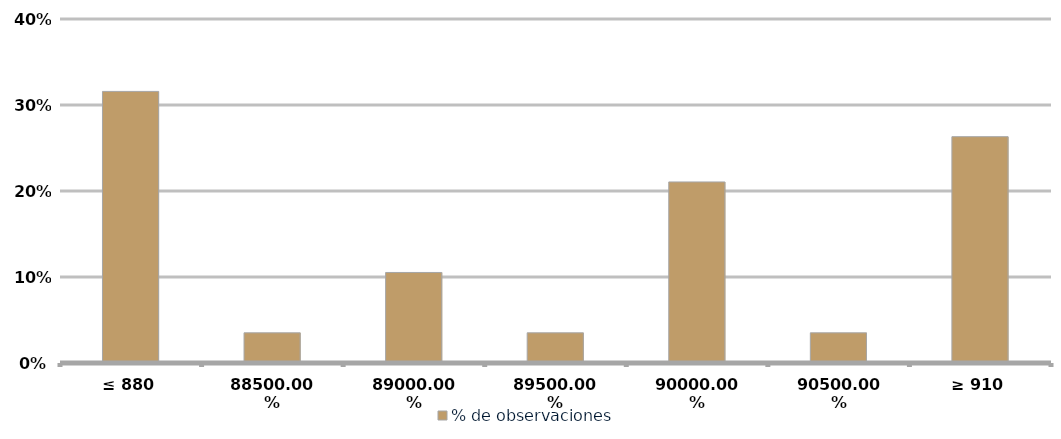
| Category | % de observaciones  |
|---|---|
| ≤ 880 | 0.316 |
| 885 | 0.035 |
| 890 | 0.105 |
| 895 | 0.035 |
| 900 | 0.211 |
| 905 | 0.035 |
| ≥ 910 | 0.263 |